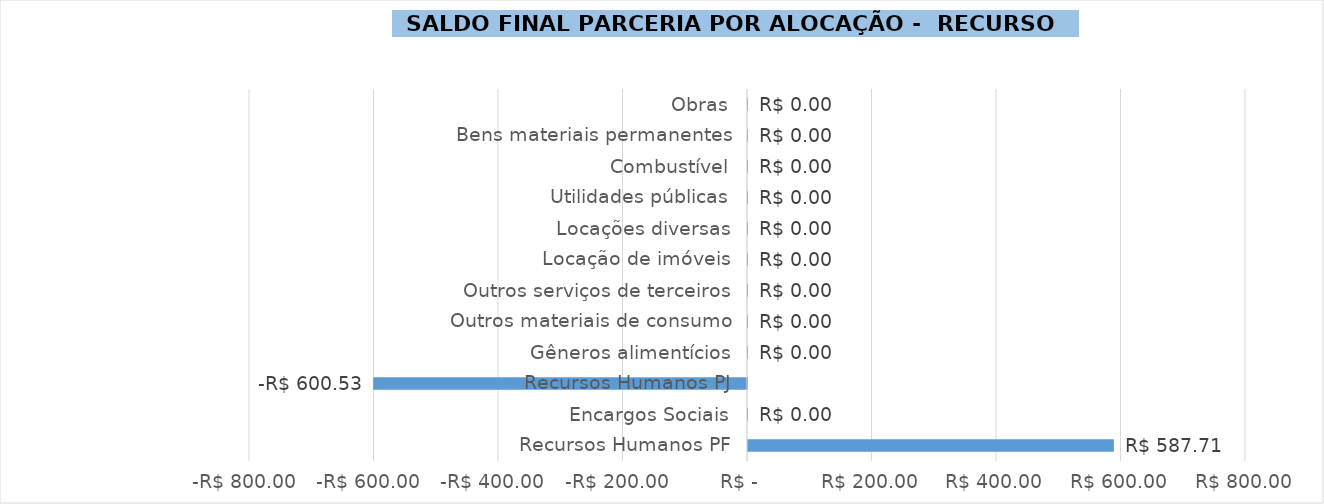
| Category | Saldo Final 2018 |
|---|---|
| Recursos Humanos PF | 587.712 |
| Encargos Sociais | 0 |
| Recursos Humanos PJ | -600.532 |
| Gêneros alimentícios | 0 |
| Outros materiais de consumo | 0 |
| Outros serviços de terceiros | 0 |
| Locação de imóveis | 0 |
| Locações diversas | 0 |
| Utilidades públicas | 0 |
| Combustível | 0 |
| Bens materiais permanentes | 0 |
| Obras | 0 |